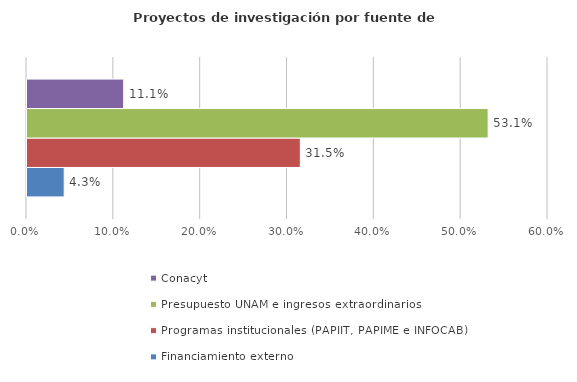
| Category | Financiamiento externo | Programas institucionales (PAPIIT, PAPIME e INFOCAB) | Presupuesto UNAM e ingresos extraordinarios | Conacyt |
|---|---|---|---|---|
| 0 | 0.043 | 0.315 | 0.531 | 0.111 |